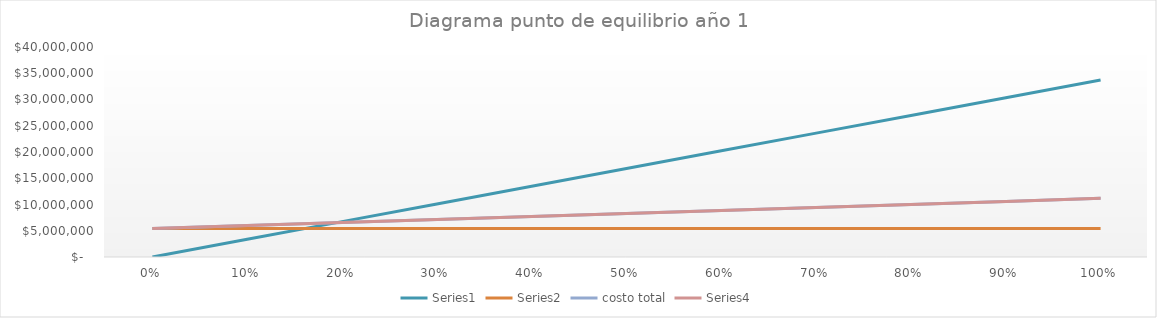
| Category | Series 4 | Series 5 | costo total | Series 7 |
|---|---|---|---|---|
| 0.0 | 0 | 5405854.444 | 5405854.444 | 5405854.444 |
| 0.1 | 3370360 | 5405854.444 | 5982154.444 | 5982154.444 |
| 0.2 | 6740720 | 5405854.444 | 6558454.444 | 6558454.444 |
| 0.3 | 10111080 | 5405854.444 | 7134754.444 | 7134754.444 |
| 0.4 | 13481440 | 5405854.444 | 7711054.444 | 7711054.444 |
| 0.5 | 16851800 | 5405854.444 | 8287354.444 | 8287354.444 |
| 0.6 | 20222160 | 5405854.444 | 8863654.444 | 8863654.444 |
| 0.7 | 23592520 | 5405854.444 | 9439954.444 | 9439954.444 |
| 0.8 | 26962880 | 5405854.444 | 10016254.444 | 10016254.444 |
| 0.9 | 30333240 | 5405854.444 | 10592554.444 | 10592554.444 |
| 1.0 | 33703600 | 5405854.444 | 11168854.444 | 11168854.444 |